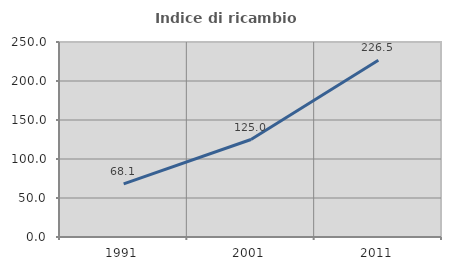
| Category | Indice di ricambio occupazionale  |
|---|---|
| 1991.0 | 68.058 |
| 2001.0 | 125 |
| 2011.0 | 226.479 |